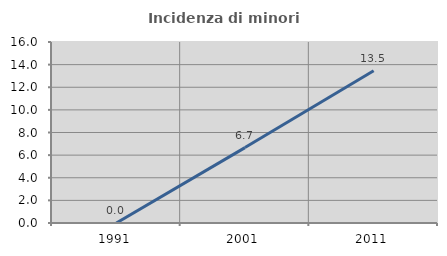
| Category | Incidenza di minori stranieri |
|---|---|
| 1991.0 | 0 |
| 2001.0 | 6.667 |
| 2011.0 | 13.462 |